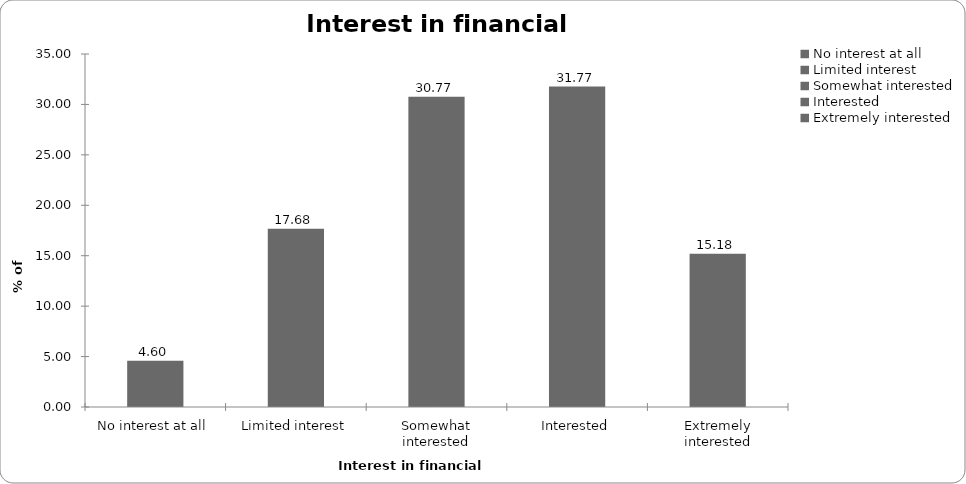
| Category | Interest in financial planning |
|---|---|
| No interest at all | 4.595 |
| Limited interest | 17.682 |
| Somewhat interested | 30.769 |
| Interested | 31.768 |
| Extremely interested | 15.185 |